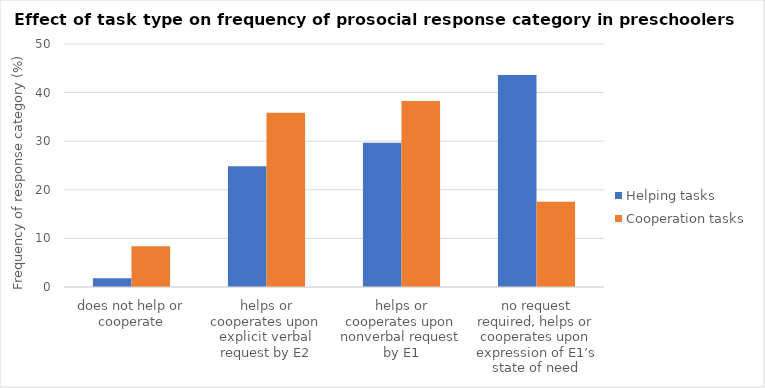
| Category | Helping tasks | Cooperation tasks |
|---|---|---|
| does not help or cooperate | 1.8 | 8.367 |
| helps or cooperates upon explicit verbal request by E2 | 24.848 | 35.857 |
| helps or cooperates upon nonverbal request by E1 | 29.697 | 38.247 |
| no request required, helps or cooperates upon expression of E1’s state of need | 43.636 | 17.53 |